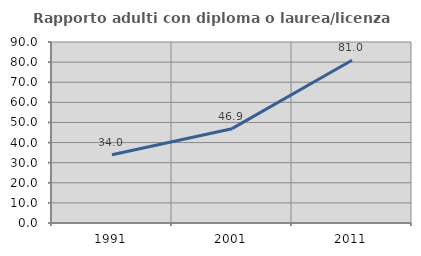
| Category | Rapporto adulti con diploma o laurea/licenza media  |
|---|---|
| 1991.0 | 33.971 |
| 2001.0 | 46.906 |
| 2011.0 | 80.952 |